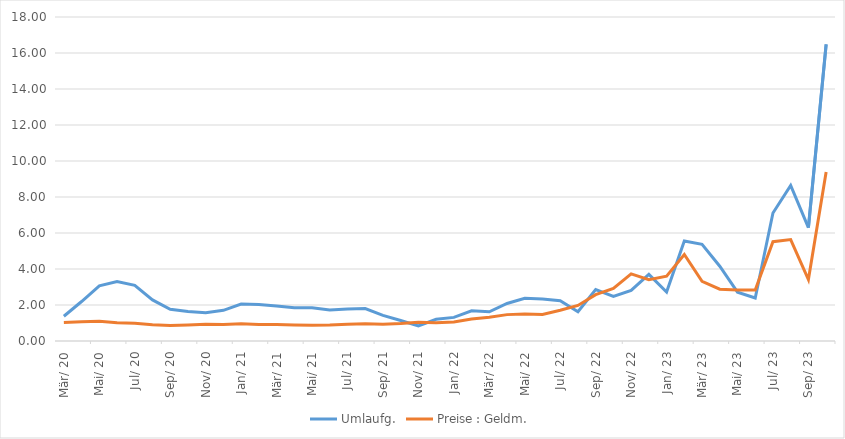
| Category | Umlaufg. | Preise : Geldm. |
|---|---|---|
| 1920-03-05 | 1.375 | 1.031 |
| 1920-04-04 12:00:00 | 2.194 | 1.073 |
| 1920-05-05 | 3.061 | 1.102 |
| 1920-06-04 12:00:00 | 3.307 | 1.019 |
| 1920-07-05 | 3.094 | 0.981 |
| 1920-08-04 12:00:00 | 2.281 | 0.908 |
| 1920-09-04 | 1.759 | 0.861 |
| 1920-10-04 12:00:00 | 1.641 | 0.89 |
| 1920-11-04 | 1.568 | 0.928 |
| 1920-12-04 12:00:00 | 1.703 | 0.912 |
| 1921-01-04 | 2.053 | 0.962 |
| 1921-02-03 12:00:00 | 2.028 | 0.922 |
| 1921-03-06 | 1.941 | 0.91 |
| 1921-04-05 12:00:00 | 1.844 | 0.892 |
| 1921-05-06 | 1.84 | 0.881 |
| 1921-06-05 12:00:00 | 1.728 | 0.884 |
| 1921-07-06 | 1.772 | 0.927 |
| 1921-08-05 12:00:00 | 1.801 | 0.965 |
| 1921-09-05 | 1.427 | 0.93 |
| 1921-10-05 12:00:00 | 1.141 | 0.969 |
| 1921-11-05 | 0.836 | 1.044 |
| 1921-12-05 12:00:00 | 1.21 | 1.008 |
| 1922-01-05 | 1.312 | 1.055 |
| 1922-02-04 12:00:00 | 1.681 | 1.22 |
| 1922-03-07 | 1.62 | 1.326 |
| 1922-04-06 12:00:00 | 2.084 | 1.465 |
| 1922-05-07 | 2.373 | 1.504 |
| 1922-06-06 12:00:00 | 2.327 | 1.475 |
| 1922-07-07 | 2.236 | 1.706 |
| 1922-08-06 12:00:00 | 1.623 | 1.974 |
| 1922-09-06 | 2.861 | 2.575 |
| 1922-10-06 12:00:00 | 2.472 | 2.927 |
| 1922-11-06 | 2.816 | 3.727 |
| 1922-12-06 12:00:00 | 3.703 | 3.401 |
| 1923-01-06 | 2.722 | 3.602 |
| 1923-02-05 12:00:00 | 5.553 | 4.805 |
| 1923-03-08 | 5.37 | 3.31 |
| 1923-04-07 12:00:00 | 4.154 | 2.876 |
| 1923-05-08 | 2.712 | 2.838 |
| 1923-06-07 12:00:00 | 2.388 | 2.828 |
| 1923-07-08 | 7.108 | 5.515 |
| 1923-08-07 12:00:00 | 8.638 | 5.634 |
| 1923-09-07 | 6.298 | 3.414 |
| 1923-10-07 12:00:00 | 16.478 | 9.386 |